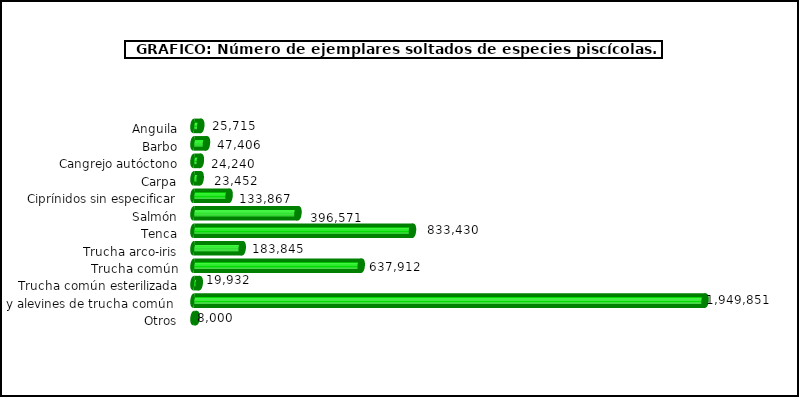
| Category | Series 1 |
|---|---|
| Anguila | 25715 |
| Barbo | 47406 |
| Cangrejo autóctono | 24240 |
| Carpa | 23452 |
| Ciprínidos sin especificar | 133867 |
| Salmón | 396571 |
| Tenca | 833430 |
| Trucha arco-iris | 183845 |
| Trucha común | 637912 |
| Trucha común esterilizada | 19932 |
| Huevos y alevines de trucha común  | 1949851 |
| Otros | 8000 |